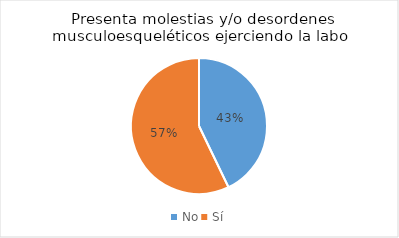
| Category | Series 0 |
|---|---|
| No | 3 |
| Sí | 4 |